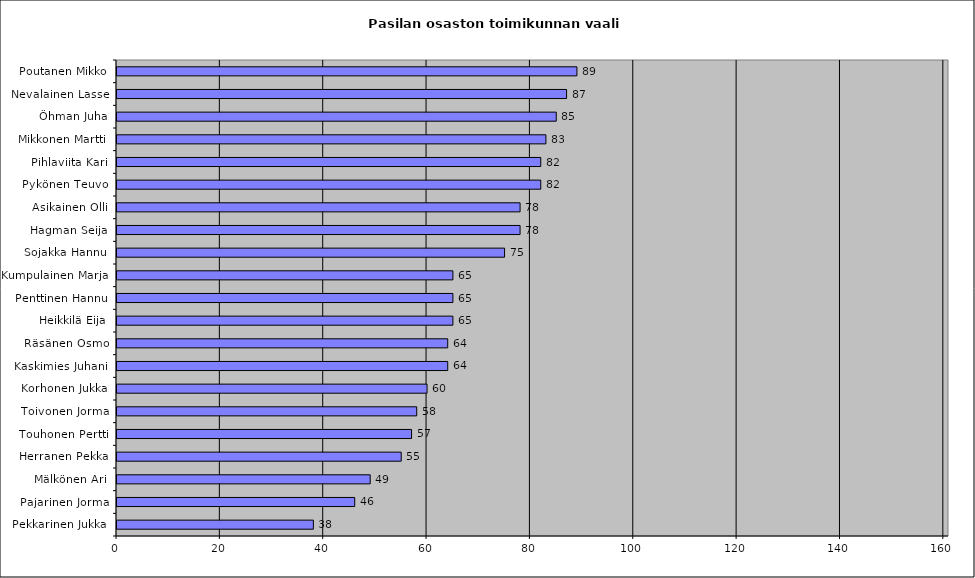
| Category | Series 0 |
|---|---|
| Poutanen Mikko | 89 |
| Nevalainen Lasse | 87 |
| Öhman Juha | 85 |
| Mikkonen Martti | 83 |
| Pihlaviita Kari | 82 |
| Pykönen Teuvo | 82 |
| Asikainen Olli | 78 |
| Hagman Seija | 78 |
| Sojakka Hannu | 75 |
| Kumpulainen Marja | 65 |
| Penttinen Hannu | 65 |
| Heikkilä Eija | 65 |
| Räsänen Osmo | 64 |
| Kaskimies Juhani | 64 |
| Korhonen Jukka | 60 |
| Toivonen Jorma | 58 |
| Touhonen Pertti | 57 |
| Herranen Pekka | 55 |
| Mälkönen Ari | 49 |
| Pajarinen Jorma | 46 |
| Pekkarinen Jukka | 38 |